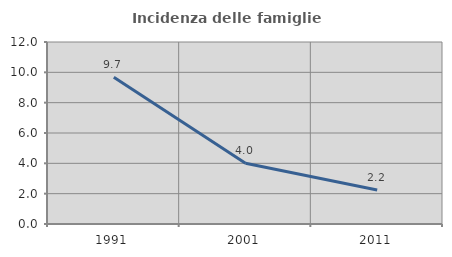
| Category | Incidenza delle famiglie numerose |
|---|---|
| 1991.0 | 9.681 |
| 2001.0 | 4.007 |
| 2011.0 | 2.238 |